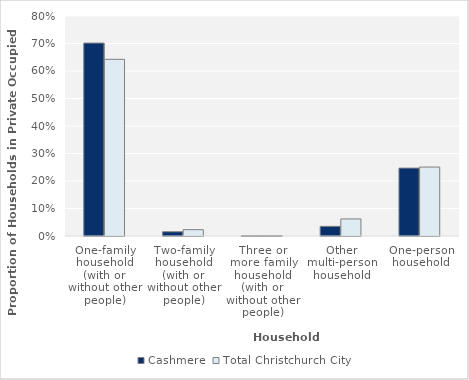
| Category | Cashmere | Total Christchurch City |
|---|---|---|
| One-family household (with or without other people) | 0.702 |  |
| Two-family household (with or without other people) | 0.015 |  |
| Three or more family household (with or without other people) | 0.001 |  |
| Other multi-person household | 0.035 |  |
| One-person household | 0.247 |  |